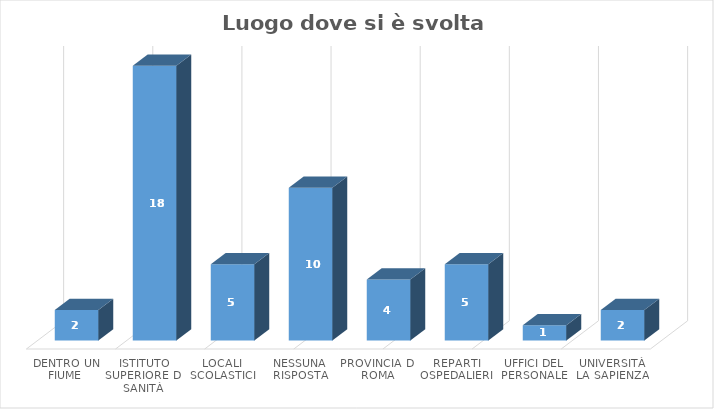
| Category | Series 0 |
|---|---|
| Dentro un fiume | 2 |
| Istituto superiore di sanità | 18 |
| Locali scolastici | 5 |
| Nessuna risposta | 10 |
| Provincia di Roma | 4 |
| Reparti ospedalieri | 5 |
| Uffici del personale | 1 |
| Università La Sapienza | 2 |